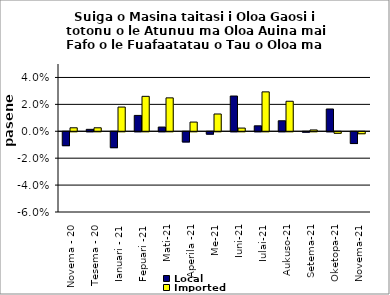
| Category | Local | Imported |
|---|---|---|
| Novema - 20 | -0.01 | 0.003 |
| Tesema - 20 | 0.001 | 0.003 |
| Ianuari - 21 | -0.012 | 0.018 |
| Fepuari -21 | 0.012 | 0.026 |
| Mati-21 | 0.003 | 0.025 |
| Aperila -21 | -0.008 | 0.007 |
| Me-21 | -0.002 | 0.013 |
| Iuni-21 | 0.026 | 0.002 |
| Iulai-21 | 0.004 | 0.029 |
| Aukuso-21 | 0.008 | 0.022 |
| Setema-21 | 0 | 0.001 |
| Oketopa-21 | 0.017 | -0.001 |
| Novema-21 | -0.009 | -0.001 |